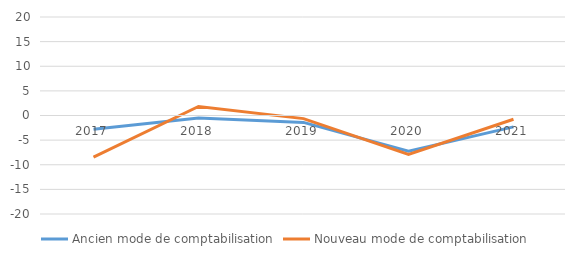
| Category | Ancien mode de comptabilisation | Nouveau mode de comptabilisation |
|---|---|---|
| 2017.0 | -2.792 | -8.435 |
| 2018.0 | -0.506 | 1.829 |
| 2019.0 | -1.399 | -0.636 |
| 2020.0 | -7.229 | -7.892 |
| 2021.0 | -2.306 | -0.769 |